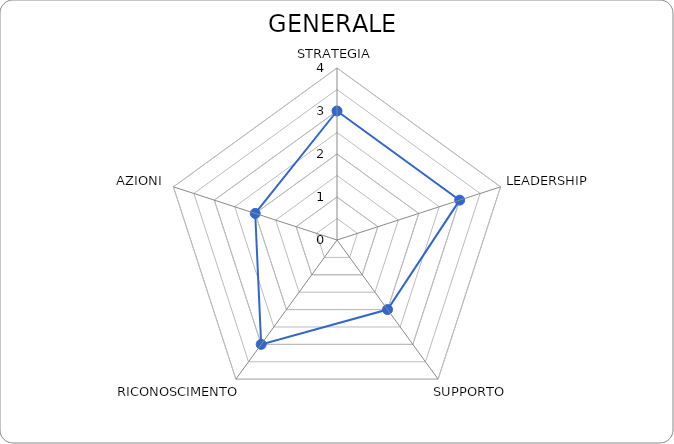
| Category | Series 0 |
|---|---|
| STRATEGIA | 3 |
| LEADERSHIP | 3 |
| SUPPORTO | 2 |
| RICONOSCIMENTO | 3 |
| AZIONI | 2 |